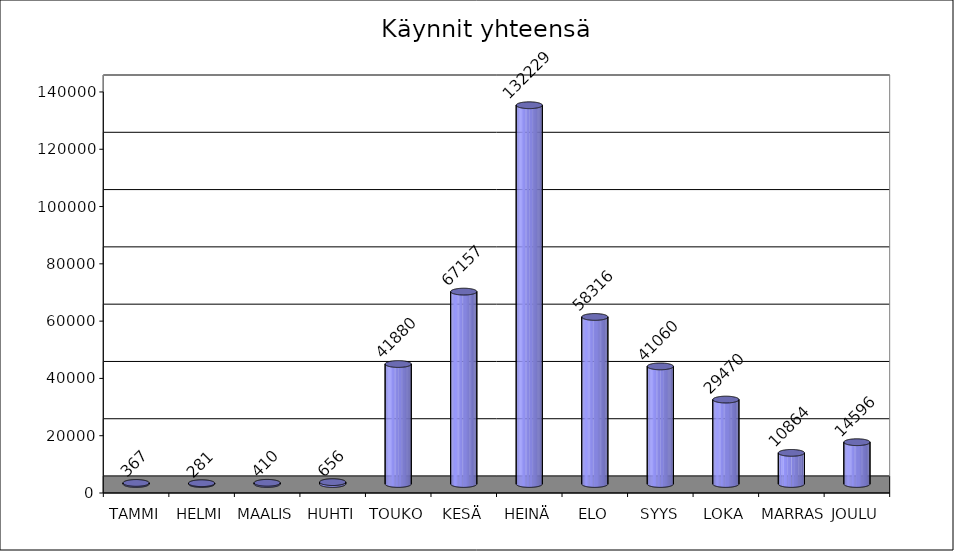
| Category | Series 0 |
|---|---|
| TAMMI | 367 |
| HELMI | 281 |
| MAALIS | 410 |
| HUHTI | 656 |
| TOUKO | 41880 |
| KESÄ | 67157 |
| HEINÄ | 132229 |
| ELO | 58316 |
| SYYS | 41060 |
| LOKA | 29470 |
| MARRAS | 10864 |
| JOULU | 14596 |